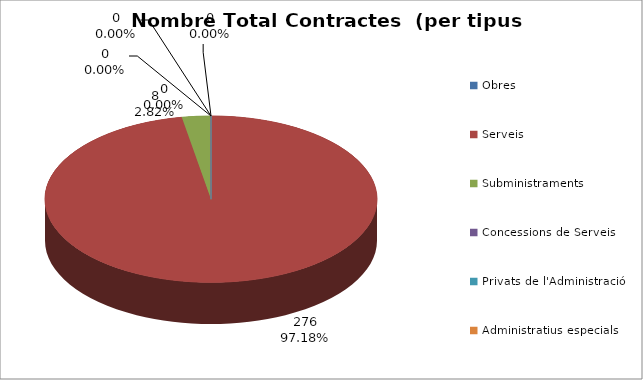
| Category | Nombre Total Contractes |
|---|---|
| Obres | 0 |
| Serveis | 276 |
| Subministraments | 8 |
| Concessions de Serveis | 0 |
| Privats de l'Administració | 0 |
| Administratius especials | 0 |